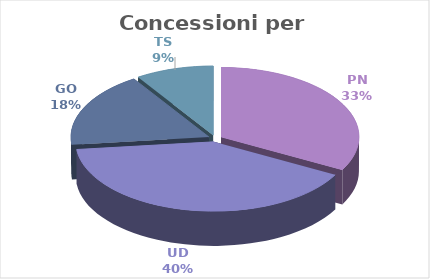
| Category | Series 0 |
|---|---|
| PN | 33912035 |
| UD | 41622230 |
| GO | 18155500 |
| TS | 9445000 |